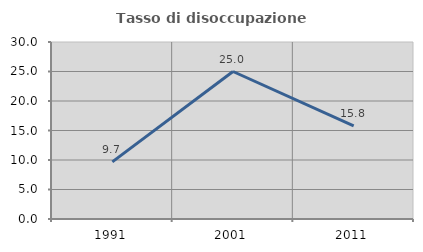
| Category | Tasso di disoccupazione giovanile  |
|---|---|
| 1991.0 | 9.677 |
| 2001.0 | 25 |
| 2011.0 | 15.789 |